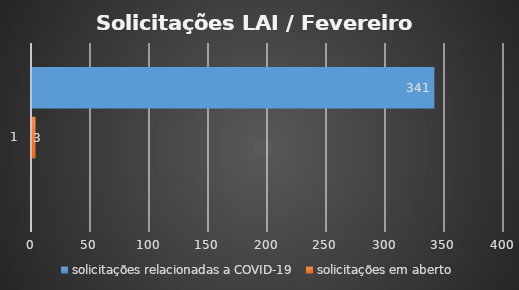
| Category | solicitações relacionadas a COVID-19 | solicitações em aberto | total de solicitações |
|---|---|---|---|
| 0 | 0 | 3 | 341 |